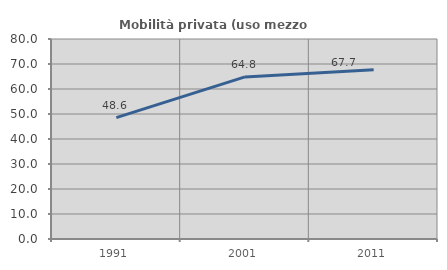
| Category | Mobilità privata (uso mezzo privato) |
|---|---|
| 1991.0 | 48.577 |
| 2001.0 | 64.826 |
| 2011.0 | 67.74 |